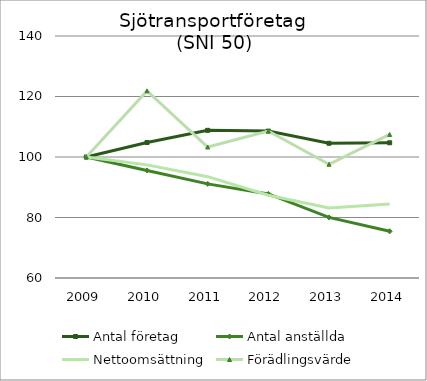
| Category | Antal företag | Antal anställda | Nettoomsättning | Förädlingsvärde |
|---|---|---|---|---|
| 2009.0 | 100 | 100 | 100 | 100 |
| 2010.0 | 104.786 | 95.559 | 97.398 | 121.861 |
| 2011.0 | 108.816 | 91.111 | 93.492 | 103.313 |
| 2012.0 | 108.564 | 87.8 | 87.38 | 108.584 |
| 2013.0 | 104.534 | 80.026 | 83.131 | 97.594 |
| 2014.0 | 104.702 | 75.439 | 84.477 | 107.452 |